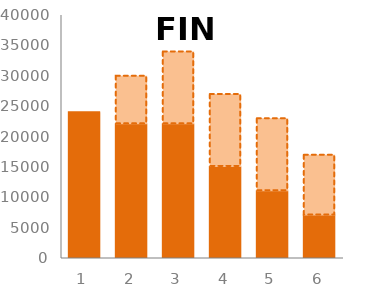
| Category | FIN | FIN imit |
|---|---|---|
| 0 | 24000 | 0 |
| 1 | 22000 | 8000 |
| 2 | 22000 | 12000 |
| 3 | 15000 | 12000 |
| 4 | 11000 | 12000 |
| 5 | 7000 | 10000 |